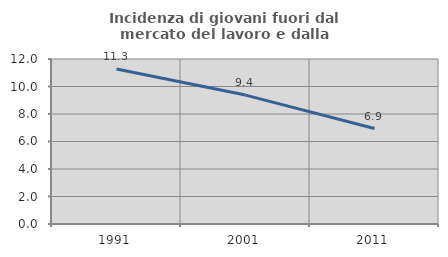
| Category | Incidenza di giovani fuori dal mercato del lavoro e dalla formazione  |
|---|---|
| 1991.0 | 11.268 |
| 2001.0 | 9.375 |
| 2011.0 | 6.944 |